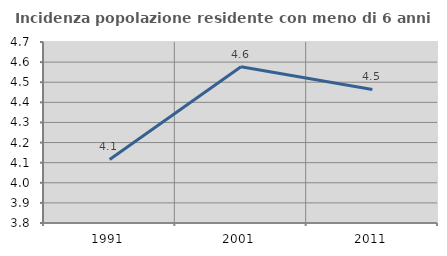
| Category | Incidenza popolazione residente con meno di 6 anni |
|---|---|
| 1991.0 | 4.116 |
| 2001.0 | 4.577 |
| 2011.0 | 4.464 |